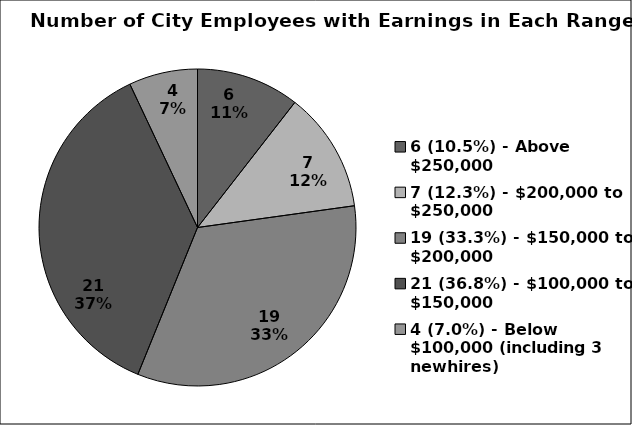
| Category | Series 0 |
|---|---|
| 6 (10.5%) - Above $250,000 | 6 |
| 7 (12.3%) - $200,000 to $250,000 | 7 |
| 19 (33.3%) - $150,000 to $200,000 | 19 |
| 21 (36.8%) - $100,000 to $150,000 | 21 |
| 4 (7.0%) - Below $100,000 (including 3 newhires) | 4 |